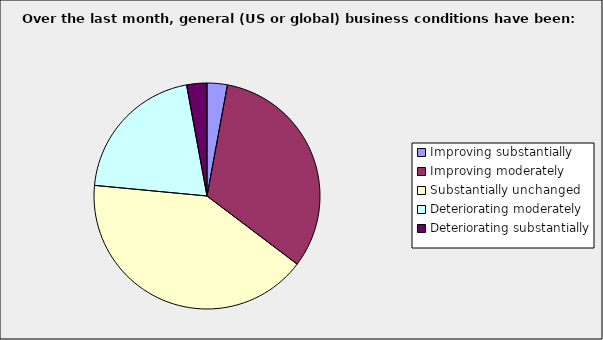
| Category | Series 0 |
|---|---|
| Improving substantially | 0.029 |
| Improving moderately | 0.324 |
| Substantially unchanged | 0.412 |
| Deteriorating moderately | 0.206 |
| Deteriorating substantially | 0.029 |